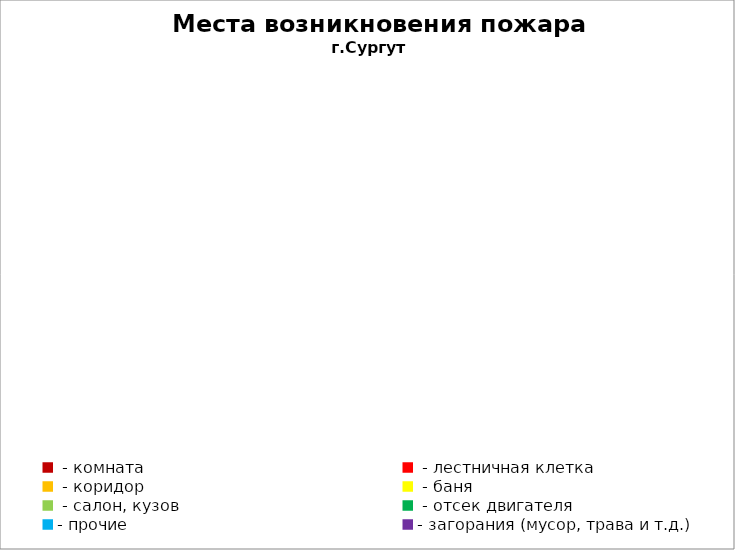
| Category | Места возникновения пожара |
|---|---|
|  - комната | 33 |
|  - лестничная клетка | 3 |
|  - коридор | 2 |
|  - баня | 5 |
|  - салон, кузов | 6 |
|  - отсек двигателя | 13 |
| - прочие | 29 |
| - загорания (мусор, трава и т.д.)  | 21 |